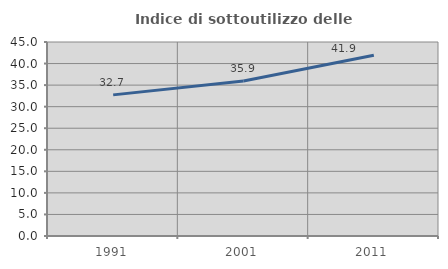
| Category | Indice di sottoutilizzo delle abitazioni  |
|---|---|
| 1991.0 | 32.737 |
| 2001.0 | 35.938 |
| 2011.0 | 41.924 |